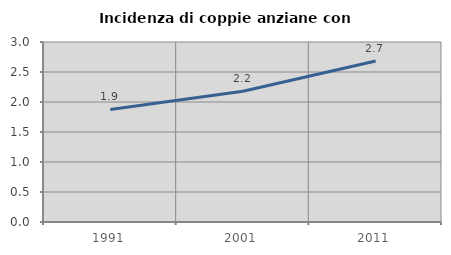
| Category | Incidenza di coppie anziane con figli |
|---|---|
| 1991.0 | 1.876 |
| 2001.0 | 2.18 |
| 2011.0 | 2.684 |